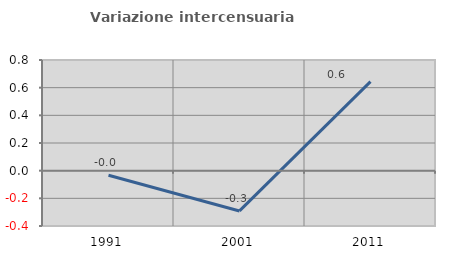
| Category | Variazione intercensuaria annua |
|---|---|
| 1991.0 | -0.034 |
| 2001.0 | -0.291 |
| 2011.0 | 0.644 |